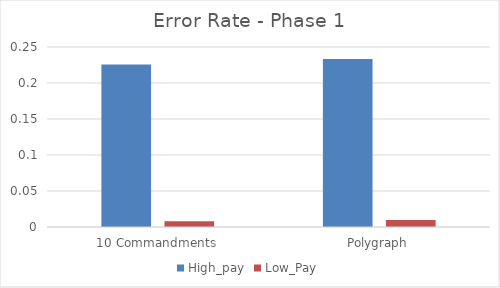
| Category | High_pay | Low_Pay |
|---|---|---|
| 10 Commandments | 0.226 | 0.008 |
| Polygraph | 0.233 | 0.01 |